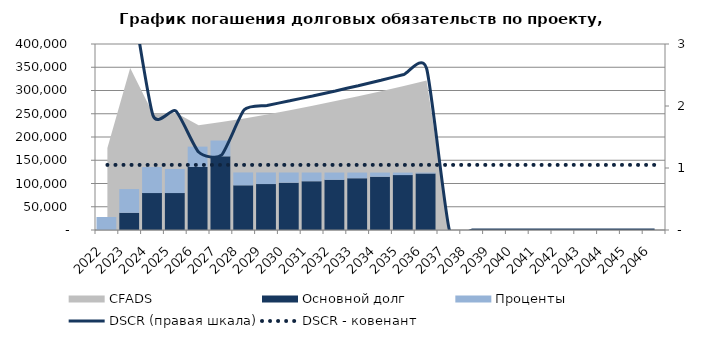
| Category | Основной долг | Проценты |
|---|---|---|
| 2022.0 | 0 | 28000 |
| 2023.0 | 37000 | 51027.5 |
| 2024.0 | 79500 | 55870 |
| 2025.0 | 79500 | 51787.5 |
| 2026.0 | 135715.762 | 43549.3 |
| 2027.0 | 158337.557 | 34128.5 |
| 2028.0 | 95967.762 | 27808.9 |
| 2029.0 | 98846.795 | 24886.7 |
| 2030.0 | 101812.199 | 21876.8 |
| 2031.0 | 104866.565 | 18776.6 |
| 2032.0 | 108012.562 | 15583.4 |
| 2033.0 | 111252.939 | 12294.4 |
| 2034.0 | 114590.527 | 8906.8 |
| 2035.0 | 118028.243 | 5417.5 |
| 2036.0 | 121569.09 | 1823.5 |
| 2037.0 | 0 | 0 |
| 2038.0 | 0 | 0 |
| 2039.0 | 0 | 0 |
| 2040.0 | 0 | 0 |
| 2041.0 | 0 | 0 |
| 2042.0 | 0 | 0 |
| 2043.0 | 0 | 0 |
| 2044.0 | 0 | 0 |
| 2045.0 | 0 | 0 |
| 2046.0 | 0 | 0 |